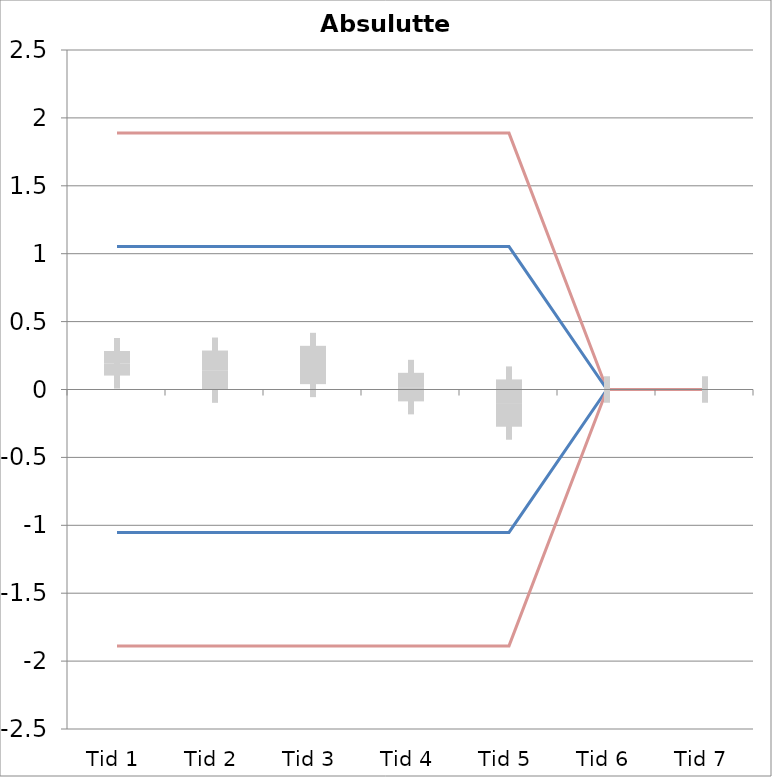
| Category | 1 | 2 | 3 | 4 | 5 | 6 | 7 | 8 | 9 | 10 | 11 | 12 | 13 | 14 | 15 | 16 | 17 | 18 | 19 | 20 | TEa | B | -B | -TEa | M |
|---|---|---|---|---|---|---|---|---|---|---|---|---|---|---|---|---|---|---|---|---|---|---|---|---|---|
| Tid 1 | 0.456 | 0.256 | 0.517 | 0.433 | 0.137 | 0.434 | 0.134 | 0.245 | 0.006 | 0.111 | 0.34 | 0.204 | 0.172 | 0.198 | 0.12 | 0.03 | -0.167 | -0.132 | 0.173 | 0 | 1.888 | 1.053 | -1.053 | -1.888 | 0.193 |
| Tid 2 | 0.055 | 0.135 | 0.355 | 0.326 | 0.091 | 1.228 | 0.161 | 0.002 | 0.008 | -0.288 | 0.094 | 0.128 | 0.031 | 0.21 | 0.157 | 0.117 | -0.134 | 0.044 | -0.016 | 0 | 1.888 | 1.053 | -1.053 | -1.888 | 0.142 |
| Tid 3 | 0.253 | 0.082 | 0.37 | 0.396 | 0.072 | 1.168 | 0.042 | 0.061 | -0.044 | -0.138 | 0.057 | 0.152 | 0.14 | 0.091 | 0.227 | 0.143 | -0.074 | 0 | 0.252 | 0 | 1.888 | 1.053 | -1.053 | -1.888 | 0.181 |
| Tid 4 | 0.567 | 0.215 | 0.121 | 0.213 | 0.034 | 0.275 | 0.025 | -0.186 | -0.165 | -0.239 | 0.048 | -0.181 | -0.015 | 0.071 | -0.009 | -0.014 | -0.26 | 0 | -0.182 | 0 | 1.888 | 1.053 | -1.053 | -1.888 | 0.018 |
| Tid 5 | -0.426 | -0.483 | -0.171 | -1.037 | -0.028 | 0.065 | 0.233 | 0.408 | -0.578 | -0.13 | 0.321 | 0.043 | -0.003 | -0.024 | 0.192 | 0.129 | -0.041 | -0.512 | 0.143 | 0 | 1.888 | 1.053 | -1.053 | -1.888 | -0.1 |
| Tid 6 | 0 | 0 | 0 | 0 | 0 | 0 | 0 | 0 | 0 | 0 | 0 | 0 | 0 | 0 | 0 | 0 | 0 | 0 | 0 | 0 | 0 | 0 | 0 | 0 | 0 |
| Tid 7 | 0 | 0 | 0 | 0 | 0 | 0 | 0 | 0 | 0 | 0 | 0 | 0 | 0 | 0 | 0 | 0 | 0 | 0 | 0 | 0 | 0 | 0 | 0 | 0 | 0 |